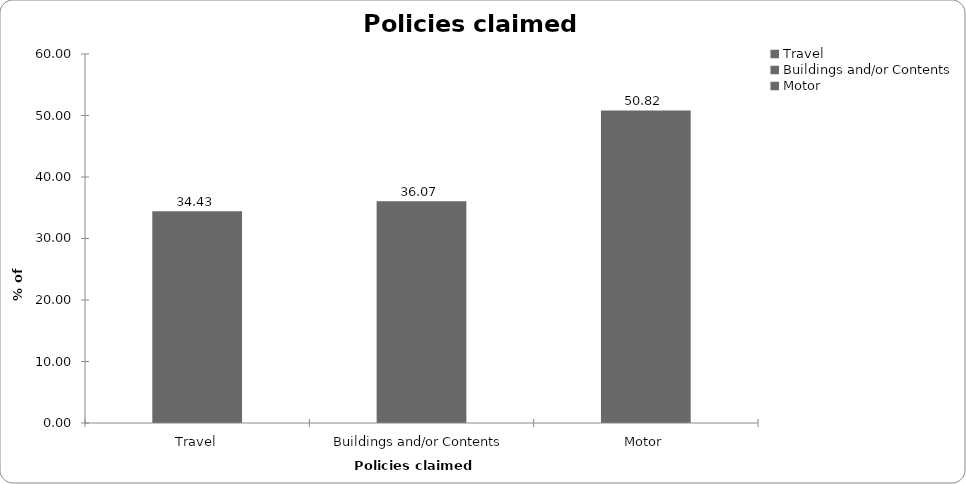
| Category | Policies claimed on |
|---|---|
| Travel | 34.426 |
| Buildings and/or Contents | 36.066 |
| Motor | 50.82 |